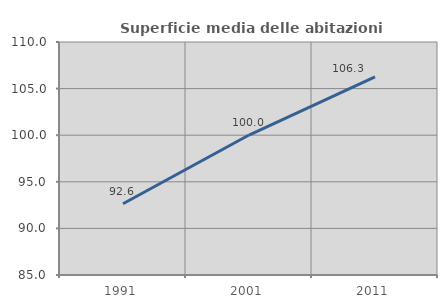
| Category | Superficie media delle abitazioni occupate |
|---|---|
| 1991.0 | 92.645 |
| 2001.0 | 100.017 |
| 2011.0 | 106.265 |